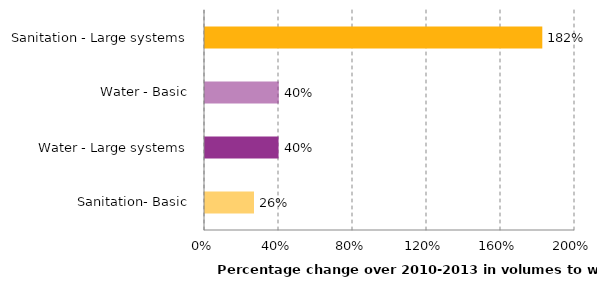
| Category | % change 2010-2013 |
|---|---|
| Sanitation- Basic | 0.265 |
| Water - Large systems | 0.398 |
| Water - Basic | 0.399 |
| Sanitation - Large systems | 1.823 |